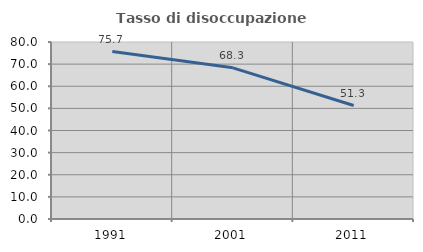
| Category | Tasso di disoccupazione giovanile  |
|---|---|
| 1991.0 | 75.676 |
| 2001.0 | 68.333 |
| 2011.0 | 51.282 |